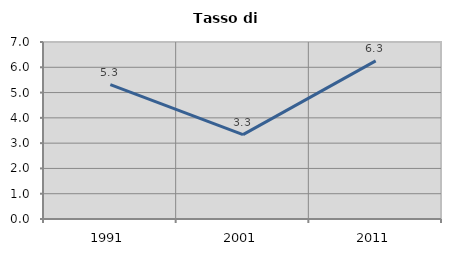
| Category | Tasso di disoccupazione   |
|---|---|
| 1991.0 | 5.316 |
| 2001.0 | 3.339 |
| 2011.0 | 6.253 |